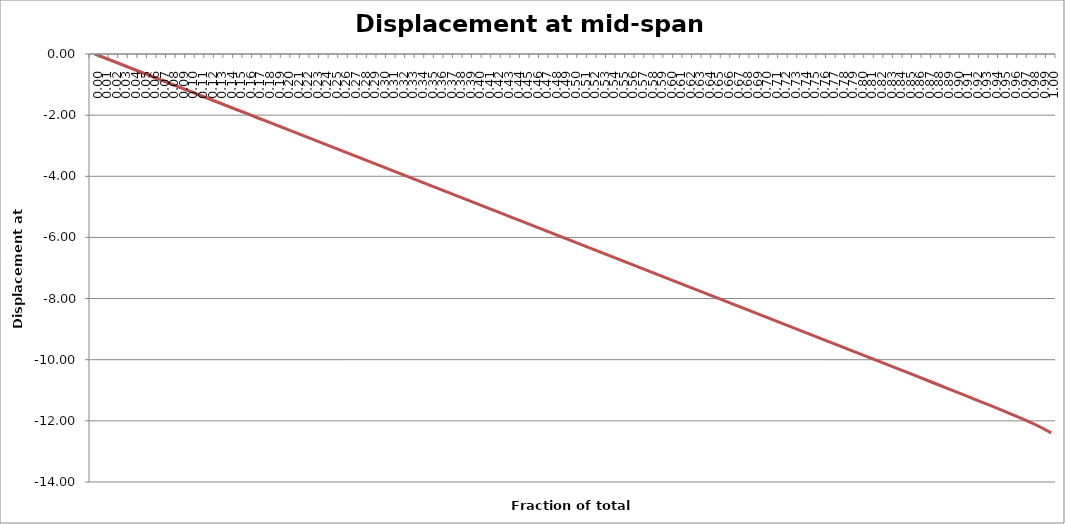
| Category | Displacement at mid-span [mm] |
|---|---|
| 0.0 | 0 |
| 0.01 | -0.123 |
| 0.02 | -0.245 |
| 0.03 | -0.368 |
| 0.04 | -0.49 |
| 0.05 | -0.613 |
| 0.06 | -0.736 |
| 0.06999999999999999 | -0.858 |
| 0.08 | -0.981 |
| 0.09 | -1.104 |
| 0.1 | -1.226 |
| 0.11000000000000001 | -1.349 |
| 0.12 | -1.472 |
| 0.13 | -1.594 |
| 0.13999999999999999 | -1.717 |
| 0.15 | -1.839 |
| 0.16 | -1.962 |
| 0.16999999999999998 | -2.085 |
| 0.18 | -2.207 |
| 0.19 | -2.33 |
| 0.2 | -2.452 |
| 0.21000000000000002 | -2.575 |
| 0.22000000000000003 | -2.698 |
| 0.22999999999999998 | -2.82 |
| 0.24 | -2.943 |
| 0.25 | -3.066 |
| 0.26 | -3.188 |
| 0.27 | -3.311 |
| 0.27999999999999997 | -3.433 |
| 0.29 | -3.556 |
| 0.3 | -3.679 |
| 0.31 | -3.801 |
| 0.32 | -3.924 |
| 0.32999999999999996 | -4.046 |
| 0.33999999999999997 | -4.169 |
| 0.35 | -4.292 |
| 0.36 | -4.414 |
| 0.37 | -4.537 |
| 0.38 | -4.66 |
| 0.39 | -4.782 |
| 0.4 | -4.905 |
| 0.41 | -5.028 |
| 0.42000000000000004 | -5.15 |
| 0.43 | -5.273 |
| 0.44000000000000006 | -5.395 |
| 0.45 | -5.518 |
| 0.45999999999999996 | -5.641 |
| 0.47000000000000003 | -5.763 |
| 0.48 | -5.886 |
| 0.49000000000000005 | -6.008 |
| 0.5 | -6.131 |
| 0.51 | -6.254 |
| 0.52 | -6.376 |
| 0.53 | -6.499 |
| 0.54 | -6.622 |
| 0.55 | -6.744 |
| 0.5599999999999999 | -6.867 |
| 0.5700000000000001 | -6.989 |
| 0.58 | -7.112 |
| 0.5900000000000001 | -7.235 |
| 0.6 | -7.357 |
| 0.61 | -7.48 |
| 0.62 | -7.602 |
| 0.63 | -7.725 |
| 0.64 | -7.848 |
| 0.65 | -7.97 |
| 0.6599999999999999 | -8.093 |
| 0.67 | -8.216 |
| 0.6799999999999999 | -8.338 |
| 0.6900000000000001 | -8.461 |
| 0.7 | -8.584 |
| 0.71 | -8.706 |
| 0.72 | -8.829 |
| 0.73 | -8.951 |
| 0.74 | -9.074 |
| 0.75 | -9.197 |
| 0.76 | -9.319 |
| 0.77 | -9.442 |
| 0.78 | -9.565 |
| 0.79 | -9.687 |
| 0.8 | -9.81 |
| 0.8099999999999999 | -9.933 |
| 0.82 | -10.056 |
| 0.8300000000000001 | -10.179 |
| 0.8400000000000001 | -10.302 |
| 0.85 | -10.425 |
| 0.86 | -10.548 |
| 0.8699999999999999 | -10.672 |
| 0.8800000000000001 | -10.795 |
| 0.89 | -10.919 |
| 0.9 | -11.044 |
| 0.9099999999999999 | -11.169 |
| 0.9199999999999999 | -11.294 |
| 0.93 | -11.419 |
| 0.9400000000000001 | -11.546 |
| 0.95 | -11.673 |
| 0.96 | -11.801 |
| 0.97 | -11.933 |
| 0.9800000000000001 | -12.071 |
| 0.99 | -12.225 |
| 1.0 | -12.392 |